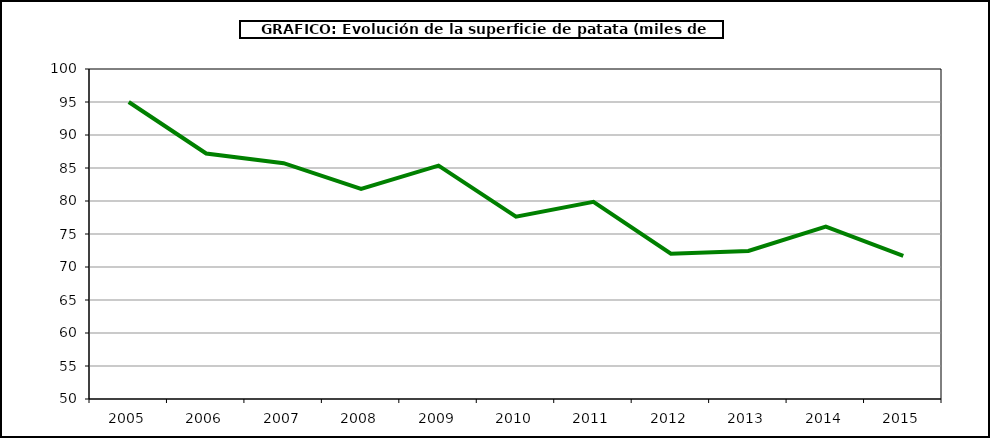
| Category | Superficie |
|---|---|
| 2005.0 | 94.998 |
| 2006.0 | 87.199 |
| 2007.0 | 85.728 |
| 2008.0 | 81.825 |
| 2009.0 | 85.366 |
| 2010.0 | 77.622 |
| 2011.0 | 79.865 |
| 2012.0 | 72.023 |
| 2013.0 | 72.431 |
| 2014.0 | 76.129 |
| 2015.0 | 71.676 |